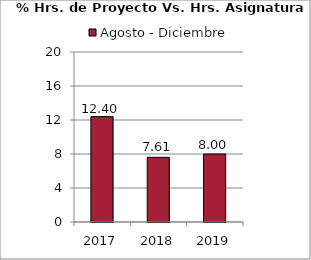
| Category | Agosto - Diciembre |
|---|---|
| 2017.0 | 12.4 |
| 2018.0 | 7.61 |
| 2019.0 | 8 |